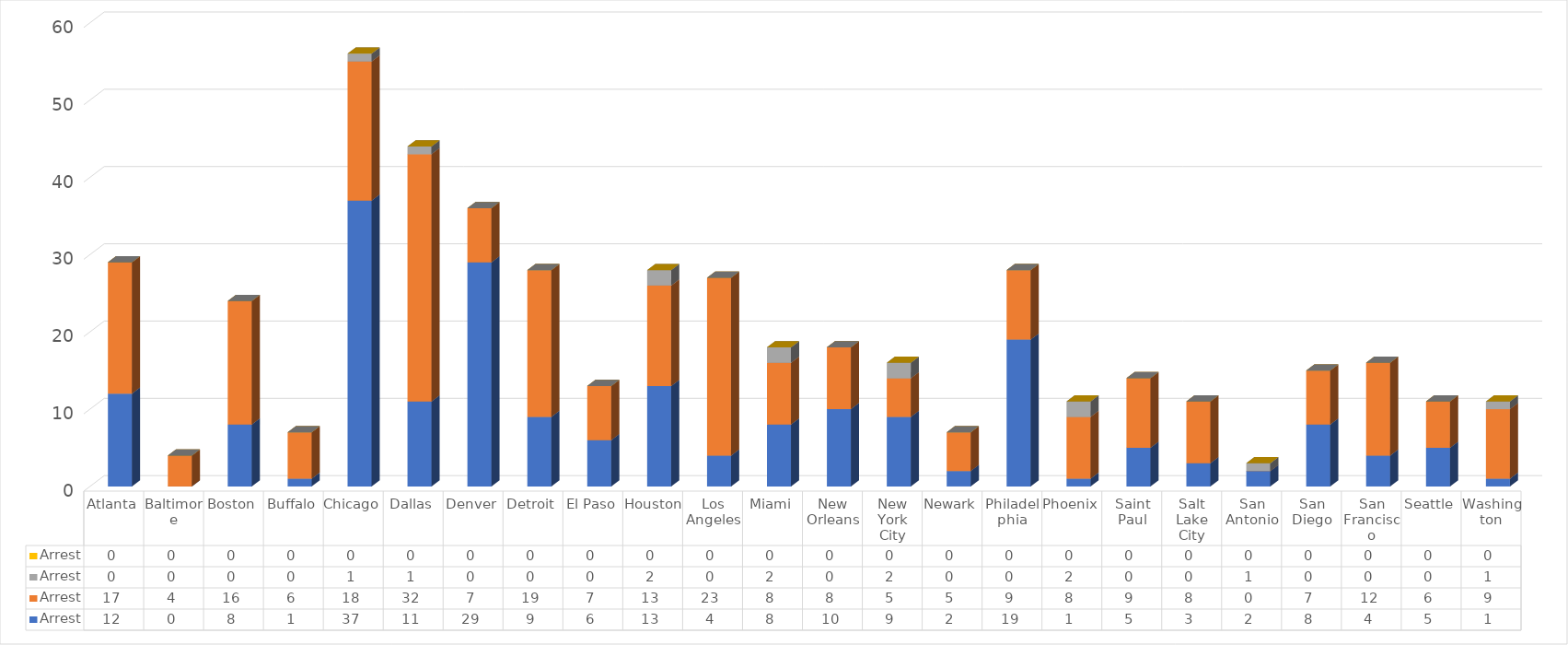
| Category | Sum of Other Priority - Arrest | Sum of Public Safety - Arrest | Sum of Border Security - Arrest | Sum of National Security - Arrest |
|---|---|---|---|---|
| Atlanta | 12 | 17 | 0 | 0 |
| Baltimore | 0 | 4 | 0 | 0 |
| Boston | 8 | 16 | 0 | 0 |
| Buffalo | 1 | 6 | 0 | 0 |
| Chicago | 37 | 18 | 1 | 0 |
| Dallas | 11 | 32 | 1 | 0 |
| Denver | 29 | 7 | 0 | 0 |
| Detroit | 9 | 19 | 0 | 0 |
| El Paso | 6 | 7 | 0 | 0 |
| Houston | 13 | 13 | 2 | 0 |
| Los Angeles | 4 | 23 | 0 | 0 |
| Miami | 8 | 8 | 2 | 0 |
| New Orleans | 10 | 8 | 0 | 0 |
| New York City | 9 | 5 | 2 | 0 |
| Newark | 2 | 5 | 0 | 0 |
| Philadelphia | 19 | 9 | 0 | 0 |
| Phoenix | 1 | 8 | 2 | 0 |
| Saint Paul | 5 | 9 | 0 | 0 |
| Salt Lake City | 3 | 8 | 0 | 0 |
| San Antonio | 2 | 0 | 1 | 0 |
| San Diego | 8 | 7 | 0 | 0 |
| San Francisco | 4 | 12 | 0 | 0 |
| Seattle | 5 | 6 | 0 | 0 |
| Washington | 1 | 9 | 1 | 0 |